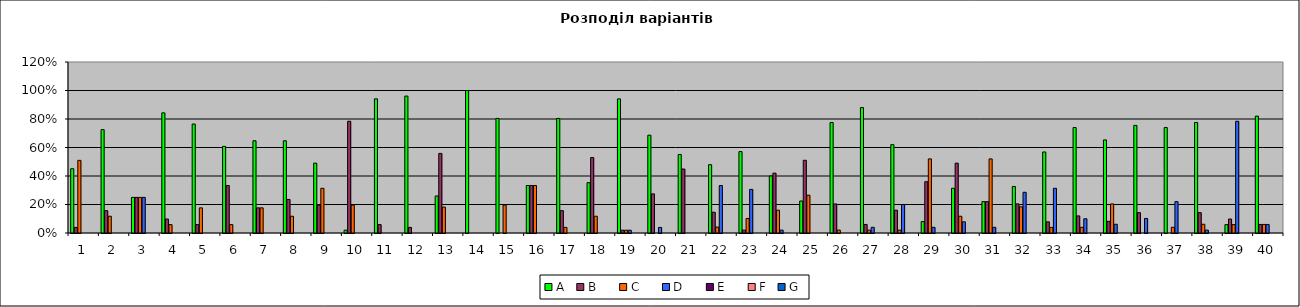
| Category | A | B    | C    | D    | E    | F | G |
|---|---|---|---|---|---|---|---|
| 0 | 0.451 | 0.039 | 0.51 | 0 | 0 | 0 | 0 |
| 1 | 0.725 | 0.157 | 0.118 | 0 | 0 | 0 | 0 |
| 2 | 0.25 | 0.25 | 0.25 | 0.25 | 0 | 0 | 0 |
| 3 | 0.843 | 0.098 | 0.059 | 0 | 0 | 0 | 0 |
| 4 | 0.765 | 0.059 | 0.176 | 0 | 0 | 0 | 0 |
| 5 | 0.608 | 0.333 | 0.059 | 0 | 0 | 0 | 0 |
| 6 | 0.647 | 0.176 | 0.176 | 0 | 0 | 0 | 0 |
| 7 | 0.647 | 0.235 | 0.118 | 0 | 0 | 0 | 0 |
| 8 | 0.49 | 0.196 | 0.314 | 0 | 0 | 0 | 0 |
| 9 | 0.02 | 0.784 | 0.196 | 0 | 0 | 0 | 0 |
| 10 | 0.941 | 0.059 | 0 | 0 | 0 | 0 | 0 |
| 11 | 0.961 | 0.039 | 0 | 0 | 0 | 0 | 0 |
| 12 | 0.26 | 0.558 | 0.182 | 0 | 0 | 0 | 0 |
| 13 | 1 | 0 | 0 | 0 | 0 | 0 | 0 |
| 14 | 0.804 | 0 | 0.196 | 0 | 0 | 0 | 0 |
| 15 | 0.333 | 0.333 | 0.333 | 0 | 0 | 0 | 0 |
| 16 | 0.804 | 0.157 | 0.039 | 0 | 0 | 0 | 0 |
| 17 | 0.353 | 0.529 | 0.118 | 0 | 0 | 0 | 0 |
| 18 | 0.941 | 0.02 | 0.02 | 0.02 | 0 | 0 | 0 |
| 19 | 0.686 | 0.275 | 0 | 0.039 | 0 | 0 | 0 |
| 20 | 0.551 | 0.449 | 0 | 0 | 0 | 0 | 0 |
| 21 | 0.479 | 0.146 | 0.042 | 0.333 | 0 | 0 | 0 |
| 22 | 0.571 | 0.02 | 0.102 | 0.306 | 0 | 0 | 0 |
| 23 | 0.4 | 0.42 | 0.16 | 0.02 | 0 | 0 | 0 |
| 24 | 0.224 | 0.51 | 0.265 | 0 | 0 | 0 | 0 |
| 25 | 0.776 | 0.204 | 0.02 | 0 | 0 | 0 | 0 |
| 26 | 0.88 | 0.06 | 0.02 | 0.04 | 0 | 0 | 0 |
| 27 | 0.62 | 0.16 | 0.02 | 0.2 | 0 | 0 | 0 |
| 28 | 0.08 | 0.36 | 0.52 | 0.04 | 0 | 0 | 0 |
| 29 | 0.314 | 0.49 | 0.118 | 0.078 | 0 | 0 | 0 |
| 30 | 0.22 | 0.22 | 0.52 | 0.04 | 0 | 0 | 0 |
| 31 | 0.327 | 0.204 | 0.184 | 0.286 | 0 | 0 | 0 |
| 32 | 0.569 | 0.078 | 0.039 | 0.314 | 0 | 0 | 0 |
| 33 | 0.74 | 0.12 | 0.04 | 0.1 | 0 | 0 | 0 |
| 34 | 0.653 | 0.082 | 0.204 | 0.061 | 0 | 0 | 0 |
| 35 | 0.755 | 0.143 | 0 | 0.102 | 0 | 0 | 0 |
| 36 | 0.74 | 0 | 0.04 | 0.22 | 0 | 0 | 0 |
| 37 | 0.776 | 0.143 | 0.061 | 0.02 | 0 | 0 | 0 |
| 38 | 0.059 | 0.098 | 0.059 | 0.784 | 0 | 0 | 0 |
| 39 | 0.82 | 0.06 | 0.06 | 0.06 | 0 | 0 | 0 |